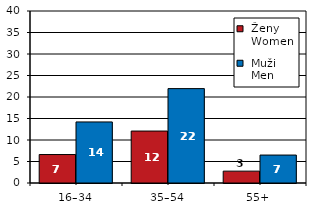
| Category |  Ženy 
 Women |  Muži 
 Men |
|---|---|---|
| 16–34 | 6.62 | 14.2 |
| 35–54 | 12.08 | 21.95 |
| 55+  | 2.76 | 6.5 |